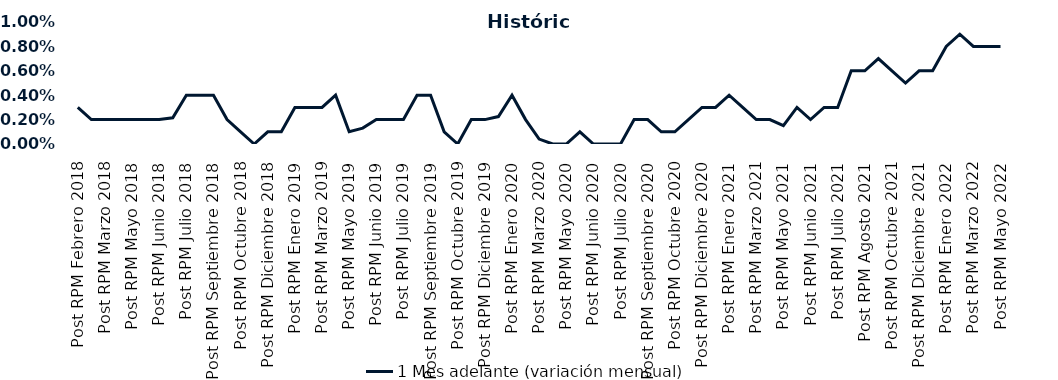
| Category | 1 Mes adelante (variación mensual) |
|---|---|
| Post RPM Febrero 2018 | 0.003 |
| Pre RPM Marzo 2018 | 0.002 |
| Post RPM Marzo 2018 | 0.002 |
| Pre RPM Mayo 2018 | 0.002 |
| Post RPM Mayo 2018 | 0.002 |
| Pre RPM Junio 2018 | 0.002 |
| Post RPM Junio 2018 | 0.002 |
| Pre RPM Julio 2018 | 0.002 |
| Post RPM Julio 2018 | 0.004 |
| Pre RPM Septiembre 2018 | 0.004 |
| Post RPM Septiembre 2018 | 0.004 |
| Pre RPM Octubre 2018 | 0.002 |
| Post RPM Octubre 2018 | 0.001 |
| Pre RPM Diciembre 2018 | 0 |
| Post RPM Diciembre 2018 | 0.001 |
| Pre RPM Enero 2019 | 0.001 |
| Post RPM Enero 2019 | 0.003 |
| Pre RPM Marzo 2019 | 0.003 |
| Post RPM Marzo 2019 | 0.003 |
| Pre RPM Mayo 2019 | 0.004 |
| Post RPM Mayo 2019 | 0.001 |
| Pre RPM Junio 2019 | 0.001 |
| Post RPM Junio 2019 | 0.002 |
| Pre RPM Julio 2019 | 0.002 |
| Post RPM Julio 2019 | 0.002 |
| Pre RPM Septiembre 2019 | 0.004 |
| Post RPM Septiembre 2019 | 0.004 |
| Pre RPM Octubre 2019 | 0.001 |
| Post RPM Octubre 2019 | 0 |
| Pre RPM Diciembre 2019 | 0.002 |
| Post RPM Diciembre 2019 | 0.002 |
| Pre RPM Enero 2020 | 0.002 |
| Post RPM Enero 2020 | 0.004 |
| Pre RPM Marzo 2020 | 0.002 |
| Post RPM Marzo 2020 | 0 |
| Pre RPM Mayo 2020 | 0 |
| Post RPM Mayo 2020 | 0 |
| Pre RPM Junio 2020 | 0.001 |
| Post RPM Junio 2020 | 0 |
| Pre RPM Julio 2020 | 0 |
| Post RPM Julio 2020 | 0 |
| Pre RPM Septiembre 2020 | 0.002 |
| Post RPM Septiembre 2020 | 0.002 |
| Pre RPM Octubre 2020 | 0.001 |
| Post RPM Octubre 2020 | 0.001 |
| Pre RPM Diciembre 2020 | 0.002 |
| Post RPM Diciembre 2020 | 0.003 |
| Pre RPM Enero 2021 | 0.003 |
| Post RPM Enero 2021 | 0.004 |
| Pre RPM Marzo 2021 | 0.003 |
| Post RPM Marzo 2021 | 0.002 |
| Pre RPM Mayo 2021 | 0.002 |
| Post RPM Mayo 2021 | 0.002 |
| Pre RPM Junio 2021 | 0.003 |
| Post RPM Junio 2021 | 0.002 |
| Pre RPM Julio 2021 | 0.003 |
| Post RPM Julio 2021 | 0.003 |
| Pre RPM Agosto 2021 | 0.006 |
| Post RPM Agosto 2021 | 0.006 |
| Pre RPM Octubre 2021 | 0.007 |
| Post RPM Octubre 2021 | 0.006 |
| Pre RPM Diciembre 2021 | 0.005 |
| Post RPM Diciembre 2021 | 0.006 |
| Pre RPM Enero 2022 | 0.006 |
| Post RPM Enero 2022 | 0.008 |
| Pre RPM Marzo 2022 | 0.009 |
| Post RPM Marzo 2022 | 0.008 |
| Pre RPM Mayo 2022 | 0.008 |
| Post RPM Mayo 2022 | 0.008 |